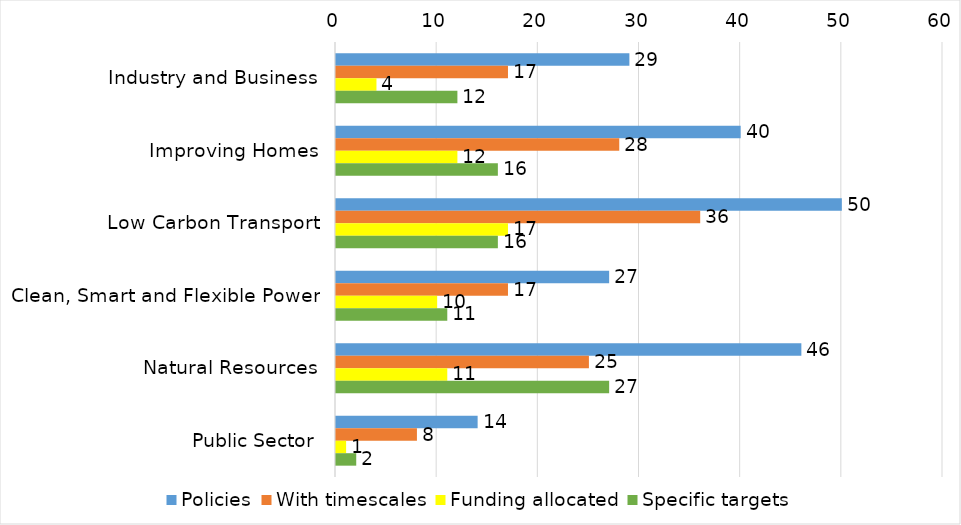
| Category | Policies | With timescales | Funding allocated | Specific targets |
|---|---|---|---|---|
| Industry and Business | 29 | 17 | 4 | 12 |
| Improving Homes | 40 | 28 | 12 | 16 |
| Low Carbon Transport | 50 | 36 | 17 | 16 |
| Clean, Smart and Flexible Power | 27 | 17 | 10 | 11 |
| Natural Resources | 46 | 25 | 11 | 27 |
| Public Sector | 14 | 8 | 1 | 2 |